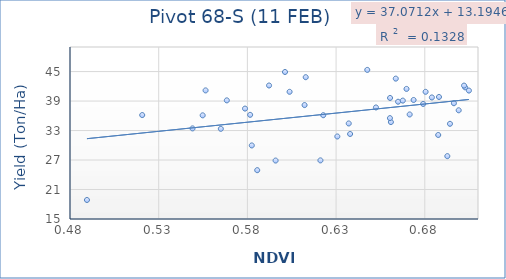
| Category | Series 0 |
|---|---|
| 0.688005 | 39.83 |
| 0.66365 | 43.563 |
| 0.696412 | 38.557 |
| 0.692707 | 27.79 |
| 0.704877 | 41.133 |
| 0.664948 | 38.86 |
| 0.699114 | 37.12 |
| 0.683997 | 39.733 |
| 0.667611 | 39.09 |
| 0.660895 | 34.72 |
| 0.64758 | 45.34 |
| 0.592214 | 42.167 |
| 0.612236 | 38.18 |
| 0.520709 | 36.147 |
| 0.582477 | 29.967 |
| 0.585543 | 24.933 |
| 0.489558 | 18.867 |
| 0.556435 | 41.167 |
| 0.6942 | 34.367 |
| 0.612882 | 43.853 |
| 0.549078 | 33.437 |
| 0.680464 | 40.877 |
| 0.671482 | 36.27 |
| 0.66036 | 35.523 |
| 0.702758 | 41.79 |
| 0.702131 | 42.147 |
| 0.660421 | 39.63 |
| 0.637896 | 32.297 |
| 0.669703 | 41.467 |
| 0.679074 | 38.41 |
| 0.622761 | 36.117 |
| 0.62117 | 26.927 |
| 0.652472 | 37.697 |
| 0.595902 | 26.893 |
| 0.554793 | 36.093 |
| 0.603782 | 40.88 |
| 0.578664 | 37.467 |
| 0.601196 | 44.913 |
| 0.565025 | 33.35 |
| 0.673699 | 39.217 |
| 0.630704 | 31.79 |
| 0.568403 | 39.14 |
| 0.63713 | 34.44 |
| 0.581547 | 36.193 |
| 0.687578 | 32.093 |